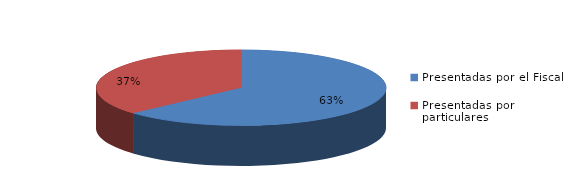
| Category | Series 0 |
|---|---|
| Presentadas por el Fiscal | 397 |
| Presentadas por particulares | 231 |